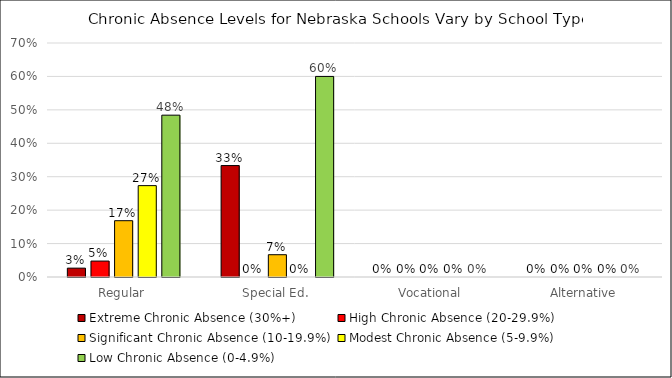
| Category | Extreme Chronic Absence (30%+) | High Chronic Absence (20-29.9%) | Significant Chronic Absence (10-19.9%) | Modest Chronic Absence (5-9.9%) | Low Chronic Absence (0-4.9%) |
|---|---|---|---|---|---|
| Regular | 0.026 | 0.048 | 0.168 | 0.273 | 0.484 |
| Special Ed. | 0.333 | 0 | 0.067 | 0 | 0.6 |
| Vocational | 0 | 0 | 0 | 0 | 0 |
| Alternative | 0 | 0 | 0 | 0 | 0 |